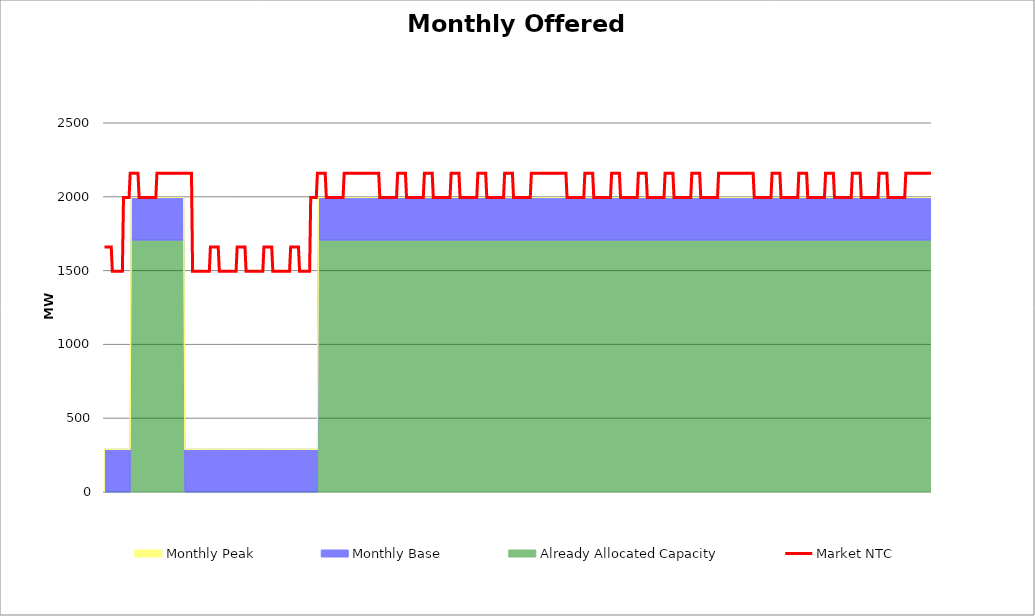
| Category | Market NTC |
|---|---|
| 0 | 1660 |
| 1 | 1660 |
| 2 | 1660 |
| 3 | 1660 |
| 4 | 1660 |
| 5 | 1660 |
| 6 | 1660 |
| 7 | 1495 |
| 8 | 1495 |
| 9 | 1495 |
| 10 | 1495 |
| 11 | 1495 |
| 12 | 1495 |
| 13 | 1495 |
| 14 | 1495 |
| 15 | 1495 |
| 16 | 1495 |
| 17 | 1995 |
| 18 | 1995 |
| 19 | 1995 |
| 20 | 1995 |
| 21 | 1995 |
| 22 | 1995 |
| 23 | 2160 |
| 24 | 2160 |
| 25 | 2160 |
| 26 | 2160 |
| 27 | 2160 |
| 28 | 2160 |
| 29 | 2160 |
| 30 | 2160 |
| 31 | 1995 |
| 32 | 1995 |
| 33 | 1995 |
| 34 | 1995 |
| 35 | 1995 |
| 36 | 1995 |
| 37 | 1995 |
| 38 | 1995 |
| 39 | 1995 |
| 40 | 1995 |
| 41 | 1995 |
| 42 | 1995 |
| 43 | 1995 |
| 44 | 1995 |
| 45 | 1995 |
| 46 | 1995 |
| 47 | 2160 |
| 48 | 2160 |
| 49 | 2160 |
| 50 | 2160 |
| 51 | 2160 |
| 52 | 2160 |
| 53 | 2160 |
| 54 | 2160 |
| 55 | 2160 |
| 56 | 2160 |
| 57 | 2160 |
| 58 | 2160 |
| 59 | 2160 |
| 60 | 2160 |
| 61 | 2160 |
| 62 | 2160 |
| 63 | 2160 |
| 64 | 2160 |
| 65 | 2160 |
| 66 | 2160 |
| 67 | 2160 |
| 68 | 2160 |
| 69 | 2160 |
| 70 | 2160 |
| 71 | 2160 |
| 72 | 2160 |
| 73 | 2160 |
| 74 | 2160 |
| 75 | 2160 |
| 76 | 2160 |
| 77 | 2160 |
| 78 | 2160 |
| 79 | 1495 |
| 80 | 1495 |
| 81 | 1495 |
| 82 | 1495 |
| 83 | 1495 |
| 84 | 1495 |
| 85 | 1495 |
| 86 | 1495 |
| 87 | 1495 |
| 88 | 1495 |
| 89 | 1495 |
| 90 | 1495 |
| 91 | 1495 |
| 92 | 1495 |
| 93 | 1495 |
| 94 | 1495 |
| 95 | 1660 |
| 96 | 1660 |
| 97 | 1660 |
| 98 | 1660 |
| 99 | 1660 |
| 100 | 1660 |
| 101 | 1660 |
| 102 | 1660 |
| 103 | 1495 |
| 104 | 1495 |
| 105 | 1495 |
| 106 | 1495 |
| 107 | 1495 |
| 108 | 1495 |
| 109 | 1495 |
| 110 | 1495 |
| 111 | 1495 |
| 112 | 1495 |
| 113 | 1495 |
| 114 | 1495 |
| 115 | 1495 |
| 116 | 1495 |
| 117 | 1495 |
| 118 | 1495 |
| 119 | 1660 |
| 120 | 1660 |
| 121 | 1660 |
| 122 | 1660 |
| 123 | 1660 |
| 124 | 1660 |
| 125 | 1660 |
| 126 | 1660 |
| 127 | 1495 |
| 128 | 1495 |
| 129 | 1495 |
| 130 | 1495 |
| 131 | 1495 |
| 132 | 1495 |
| 133 | 1495 |
| 134 | 1495 |
| 135 | 1495 |
| 136 | 1495 |
| 137 | 1495 |
| 138 | 1495 |
| 139 | 1495 |
| 140 | 1495 |
| 141 | 1495 |
| 142 | 1495 |
| 143 | 1660 |
| 144 | 1660 |
| 145 | 1660 |
| 146 | 1660 |
| 147 | 1660 |
| 148 | 1660 |
| 149 | 1660 |
| 150 | 1660 |
| 151 | 1495 |
| 152 | 1495 |
| 153 | 1495 |
| 154 | 1495 |
| 155 | 1495 |
| 156 | 1495 |
| 157 | 1495 |
| 158 | 1495 |
| 159 | 1495 |
| 160 | 1495 |
| 161 | 1495 |
| 162 | 1495 |
| 163 | 1495 |
| 164 | 1495 |
| 165 | 1495 |
| 166 | 1495 |
| 167 | 1660 |
| 168 | 1660 |
| 169 | 1660 |
| 170 | 1660 |
| 171 | 1660 |
| 172 | 1660 |
| 173 | 1660 |
| 174 | 1660 |
| 175 | 1495 |
| 176 | 1495 |
| 177 | 1495 |
| 178 | 1495 |
| 179 | 1495 |
| 180 | 1495 |
| 181 | 1495 |
| 182 | 1495 |
| 183 | 1495 |
| 184 | 1495 |
| 185 | 1995 |
| 186 | 1995 |
| 187 | 1995 |
| 188 | 1995 |
| 189 | 1995 |
| 190 | 1995 |
| 191 | 2160 |
| 192 | 2160 |
| 193 | 2160 |
| 194 | 2160 |
| 195 | 2160 |
| 196 | 2160 |
| 197 | 2160 |
| 198 | 2160 |
| 199 | 1995 |
| 200 | 1995 |
| 201 | 1995 |
| 202 | 1995 |
| 203 | 1995 |
| 204 | 1995 |
| 205 | 1995 |
| 206 | 1995 |
| 207 | 1995 |
| 208 | 1995 |
| 209 | 1995 |
| 210 | 1995 |
| 211 | 1995 |
| 212 | 1995 |
| 213 | 1995 |
| 214 | 1995 |
| 215 | 2160 |
| 216 | 2160 |
| 217 | 2160 |
| 218 | 2160 |
| 219 | 2160 |
| 220 | 2160 |
| 221 | 2160 |
| 222 | 2160 |
| 223 | 2160 |
| 224 | 2160 |
| 225 | 2160 |
| 226 | 2160 |
| 227 | 2160 |
| 228 | 2160 |
| 229 | 2160 |
| 230 | 2160 |
| 231 | 2160 |
| 232 | 2160 |
| 233 | 2160 |
| 234 | 2160 |
| 235 | 2160 |
| 236 | 2160 |
| 237 | 2160 |
| 238 | 2160 |
| 239 | 2160 |
| 240 | 2160 |
| 241 | 2160 |
| 242 | 2160 |
| 243 | 2160 |
| 244 | 2160 |
| 245 | 2160 |
| 246 | 2160 |
| 247 | 1995 |
| 248 | 1995 |
| 249 | 1995 |
| 250 | 1995 |
| 251 | 1995 |
| 252 | 1995 |
| 253 | 1995 |
| 254 | 1995 |
| 255 | 1995 |
| 256 | 1995 |
| 257 | 1995 |
| 258 | 1995 |
| 259 | 1995 |
| 260 | 1995 |
| 261 | 1995 |
| 262 | 1995 |
| 263 | 2160 |
| 264 | 2160 |
| 265 | 2160 |
| 266 | 2160 |
| 267 | 2160 |
| 268 | 2160 |
| 269 | 2160 |
| 270 | 2160 |
| 271 | 1995 |
| 272 | 1995 |
| 273 | 1995 |
| 274 | 1995 |
| 275 | 1995 |
| 276 | 1995 |
| 277 | 1995 |
| 278 | 1995 |
| 279 | 1995 |
| 280 | 1995 |
| 281 | 1995 |
| 282 | 1995 |
| 283 | 1995 |
| 284 | 1995 |
| 285 | 1995 |
| 286 | 1995 |
| 287 | 2160 |
| 288 | 2160 |
| 289 | 2160 |
| 290 | 2160 |
| 291 | 2160 |
| 292 | 2160 |
| 293 | 2160 |
| 294 | 2160 |
| 295 | 1995 |
| 296 | 1995 |
| 297 | 1995 |
| 298 | 1995 |
| 299 | 1995 |
| 300 | 1995 |
| 301 | 1995 |
| 302 | 1995 |
| 303 | 1995 |
| 304 | 1995 |
| 305 | 1995 |
| 306 | 1995 |
| 307 | 1995 |
| 308 | 1995 |
| 309 | 1995 |
| 310 | 1995 |
| 311 | 2160 |
| 312 | 2160 |
| 313 | 2160 |
| 314 | 2160 |
| 315 | 2160 |
| 316 | 2160 |
| 317 | 2160 |
| 318 | 2160 |
| 319 | 1995 |
| 320 | 1995 |
| 321 | 1995 |
| 322 | 1995 |
| 323 | 1995 |
| 324 | 1995 |
| 325 | 1995 |
| 326 | 1995 |
| 327 | 1995 |
| 328 | 1995 |
| 329 | 1995 |
| 330 | 1995 |
| 331 | 1995 |
| 332 | 1995 |
| 333 | 1995 |
| 334 | 1995 |
| 335 | 2160 |
| 336 | 2160 |
| 337 | 2160 |
| 338 | 2160 |
| 339 | 2160 |
| 340 | 2160 |
| 341 | 2160 |
| 342 | 2160 |
| 343 | 1995 |
| 344 | 1995 |
| 345 | 1995 |
| 346 | 1995 |
| 347 | 1995 |
| 348 | 1995 |
| 349 | 1995 |
| 350 | 1995 |
| 351 | 1995 |
| 352 | 1995 |
| 353 | 1995 |
| 354 | 1995 |
| 355 | 1995 |
| 356 | 1995 |
| 357 | 1995 |
| 358 | 1995 |
| 359 | 2160 |
| 360 | 2160 |
| 361 | 2160 |
| 362 | 2160 |
| 363 | 2160 |
| 364 | 2160 |
| 365 | 2160 |
| 366 | 2160 |
| 367 | 1995 |
| 368 | 1995 |
| 369 | 1995 |
| 370 | 1995 |
| 371 | 1995 |
| 372 | 1995 |
| 373 | 1995 |
| 374 | 1995 |
| 375 | 1995 |
| 376 | 1995 |
| 377 | 1995 |
| 378 | 1995 |
| 379 | 1995 |
| 380 | 1995 |
| 381 | 1995 |
| 382 | 1995 |
| 383 | 2160 |
| 384 | 2160 |
| 385 | 2160 |
| 386 | 2160 |
| 387 | 2160 |
| 388 | 2160 |
| 389 | 2160 |
| 390 | 2160 |
| 391 | 2160 |
| 392 | 2160 |
| 393 | 2160 |
| 394 | 2160 |
| 395 | 2160 |
| 396 | 2160 |
| 397 | 2160 |
| 398 | 2160 |
| 399 | 2160 |
| 400 | 2160 |
| 401 | 2160 |
| 402 | 2160 |
| 403 | 2160 |
| 404 | 2160 |
| 405 | 2160 |
| 406 | 2160 |
| 407 | 2160 |
| 408 | 2160 |
| 409 | 2160 |
| 410 | 2160 |
| 411 | 2160 |
| 412 | 2160 |
| 413 | 2160 |
| 414 | 2160 |
| 415 | 1995 |
| 416 | 1995 |
| 417 | 1995 |
| 418 | 1995 |
| 419 | 1995 |
| 420 | 1995 |
| 421 | 1995 |
| 422 | 1995 |
| 423 | 1995 |
| 424 | 1995 |
| 425 | 1995 |
| 426 | 1995 |
| 427 | 1995 |
| 428 | 1995 |
| 429 | 1995 |
| 430 | 1995 |
| 431 | 2160 |
| 432 | 2160 |
| 433 | 2160 |
| 434 | 2160 |
| 435 | 2160 |
| 436 | 2160 |
| 437 | 2160 |
| 438 | 2160 |
| 439 | 1995 |
| 440 | 1995 |
| 441 | 1995 |
| 442 | 1995 |
| 443 | 1995 |
| 444 | 1995 |
| 445 | 1995 |
| 446 | 1995 |
| 447 | 1995 |
| 448 | 1995 |
| 449 | 1995 |
| 450 | 1995 |
| 451 | 1995 |
| 452 | 1995 |
| 453 | 1995 |
| 454 | 1995 |
| 455 | 2160 |
| 456 | 2160 |
| 457 | 2160 |
| 458 | 2160 |
| 459 | 2160 |
| 460 | 2160 |
| 461 | 2160 |
| 462 | 2160 |
| 463 | 1995 |
| 464 | 1995 |
| 465 | 1995 |
| 466 | 1995 |
| 467 | 1995 |
| 468 | 1995 |
| 469 | 1995 |
| 470 | 1995 |
| 471 | 1995 |
| 472 | 1995 |
| 473 | 1995 |
| 474 | 1995 |
| 475 | 1995 |
| 476 | 1995 |
| 477 | 1995 |
| 478 | 1995 |
| 479 | 2160 |
| 480 | 2160 |
| 481 | 2160 |
| 482 | 2160 |
| 483 | 2160 |
| 484 | 2160 |
| 485 | 2160 |
| 486 | 2160 |
| 487 | 1995 |
| 488 | 1995 |
| 489 | 1995 |
| 490 | 1995 |
| 491 | 1995 |
| 492 | 1995 |
| 493 | 1995 |
| 494 | 1995 |
| 495 | 1995 |
| 496 | 1995 |
| 497 | 1995 |
| 498 | 1995 |
| 499 | 1995 |
| 500 | 1995 |
| 501 | 1995 |
| 502 | 1995 |
| 503 | 2160 |
| 504 | 2160 |
| 505 | 2160 |
| 506 | 2160 |
| 507 | 2160 |
| 508 | 2160 |
| 509 | 2160 |
| 510 | 2160 |
| 511 | 1995 |
| 512 | 1995 |
| 513 | 1995 |
| 514 | 1995 |
| 515 | 1995 |
| 516 | 1995 |
| 517 | 1995 |
| 518 | 1995 |
| 519 | 1995 |
| 520 | 1995 |
| 521 | 1995 |
| 522 | 1995 |
| 523 | 1995 |
| 524 | 1995 |
| 525 | 1995 |
| 526 | 1995 |
| 527 | 2160 |
| 528 | 2160 |
| 529 | 2160 |
| 530 | 2160 |
| 531 | 2160 |
| 532 | 2160 |
| 533 | 2160 |
| 534 | 2160 |
| 535 | 1995 |
| 536 | 1995 |
| 537 | 1995 |
| 538 | 1995 |
| 539 | 1995 |
| 540 | 1995 |
| 541 | 1995 |
| 542 | 1995 |
| 543 | 1995 |
| 544 | 1995 |
| 545 | 1995 |
| 546 | 1995 |
| 547 | 1995 |
| 548 | 1995 |
| 549 | 1995 |
| 550 | 1995 |
| 551 | 2160 |
| 552 | 2160 |
| 553 | 2160 |
| 554 | 2160 |
| 555 | 2160 |
| 556 | 2160 |
| 557 | 2160 |
| 558 | 2160 |
| 559 | 2160 |
| 560 | 2160 |
| 561 | 2160 |
| 562 | 2160 |
| 563 | 2160 |
| 564 | 2160 |
| 565 | 2160 |
| 566 | 2160 |
| 567 | 2160 |
| 568 | 2160 |
| 569 | 2160 |
| 570 | 2160 |
| 571 | 2160 |
| 572 | 2160 |
| 573 | 2160 |
| 574 | 2160 |
| 575 | 2160 |
| 576 | 2160 |
| 577 | 2160 |
| 578 | 2160 |
| 579 | 2160 |
| 580 | 2160 |
| 581 | 2160 |
| 582 | 2160 |
| 583 | 1995 |
| 584 | 1995 |
| 585 | 1995 |
| 586 | 1995 |
| 587 | 1995 |
| 588 | 1995 |
| 589 | 1995 |
| 590 | 1995 |
| 591 | 1995 |
| 592 | 1995 |
| 593 | 1995 |
| 594 | 1995 |
| 595 | 1995 |
| 596 | 1995 |
| 597 | 1995 |
| 598 | 1995 |
| 599 | 2160 |
| 600 | 2160 |
| 601 | 2160 |
| 602 | 2160 |
| 603 | 2160 |
| 604 | 2160 |
| 605 | 2160 |
| 606 | 2160 |
| 607 | 1995 |
| 608 | 1995 |
| 609 | 1995 |
| 610 | 1995 |
| 611 | 1995 |
| 612 | 1995 |
| 613 | 1995 |
| 614 | 1995 |
| 615 | 1995 |
| 616 | 1995 |
| 617 | 1995 |
| 618 | 1995 |
| 619 | 1995 |
| 620 | 1995 |
| 621 | 1995 |
| 622 | 1995 |
| 623 | 2160 |
| 624 | 2160 |
| 625 | 2160 |
| 626 | 2160 |
| 627 | 2160 |
| 628 | 2160 |
| 629 | 2160 |
| 630 | 2160 |
| 631 | 1995 |
| 632 | 1995 |
| 633 | 1995 |
| 634 | 1995 |
| 635 | 1995 |
| 636 | 1995 |
| 637 | 1995 |
| 638 | 1995 |
| 639 | 1995 |
| 640 | 1995 |
| 641 | 1995 |
| 642 | 1995 |
| 643 | 1995 |
| 644 | 1995 |
| 645 | 1995 |
| 646 | 1995 |
| 647 | 2160 |
| 648 | 2160 |
| 649 | 2160 |
| 650 | 2160 |
| 651 | 2160 |
| 652 | 2160 |
| 653 | 2160 |
| 654 | 2160 |
| 655 | 1995 |
| 656 | 1995 |
| 657 | 1995 |
| 658 | 1995 |
| 659 | 1995 |
| 660 | 1995 |
| 661 | 1995 |
| 662 | 1995 |
| 663 | 1995 |
| 664 | 1995 |
| 665 | 1995 |
| 666 | 1995 |
| 667 | 1995 |
| 668 | 1995 |
| 669 | 1995 |
| 670 | 1995 |
| 671 | 2160 |
| 672 | 2160 |
| 673 | 2160 |
| 674 | 2160 |
| 675 | 2160 |
| 676 | 2160 |
| 677 | 2160 |
| 678 | 2160 |
| 679 | 1995 |
| 680 | 1995 |
| 681 | 1995 |
| 682 | 1995 |
| 683 | 1995 |
| 684 | 1995 |
| 685 | 1995 |
| 686 | 1995 |
| 687 | 1995 |
| 688 | 1995 |
| 689 | 1995 |
| 690 | 1995 |
| 691 | 1995 |
| 692 | 1995 |
| 693 | 1995 |
| 694 | 1995 |
| 695 | 2160 |
| 696 | 2160 |
| 697 | 2160 |
| 698 | 2160 |
| 699 | 2160 |
| 700 | 2160 |
| 701 | 2160 |
| 702 | 2160 |
| 703 | 1995 |
| 704 | 1995 |
| 705 | 1995 |
| 706 | 1995 |
| 707 | 1995 |
| 708 | 1995 |
| 709 | 1995 |
| 710 | 1995 |
| 711 | 1995 |
| 712 | 1995 |
| 713 | 1995 |
| 714 | 1995 |
| 715 | 1995 |
| 716 | 1995 |
| 717 | 1995 |
| 718 | 1995 |
| 719 | 2160 |
| 720 | 2160 |
| 721 | 2160 |
| 722 | 2160 |
| 723 | 2160 |
| 724 | 2160 |
| 725 | 2160 |
| 726 | 2160 |
| 727 | 2160 |
| 728 | 2160 |
| 729 | 2160 |
| 730 | 2160 |
| 731 | 2160 |
| 732 | 2160 |
| 733 | 2160 |
| 734 | 2160 |
| 735 | 2160 |
| 736 | 2160 |
| 737 | 2160 |
| 738 | 2160 |
| 739 | 2160 |
| 740 | 2160 |
| 741 | 2160 |
| 742 | 2160 |